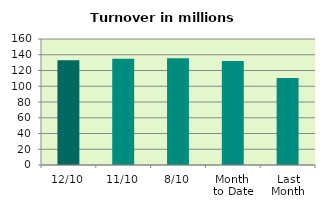
| Category | Series 0 |
|---|---|
| 12/10 | 132.969 |
| 11/10 | 134.951 |
| 8/10 | 135.421 |
| Month 
to Date | 132.099 |
| Last
Month | 110.611 |